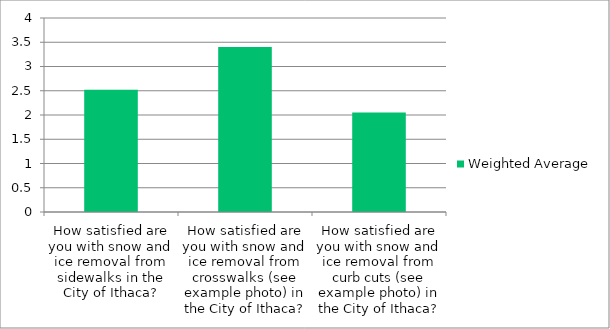
| Category | Weighted Average |
|---|---|
| How satisfied are you with snow and ice removal from sidewalks in the City of Ithaca? | 2.52 |
| How satisfied are you with snow and ice removal from crosswalks (see example photo) in the City of Ithaca? | 3.4 |
| How satisfied are you with snow and ice removal from curb cuts (see example photo) in the City of Ithaca? | 2.05 |